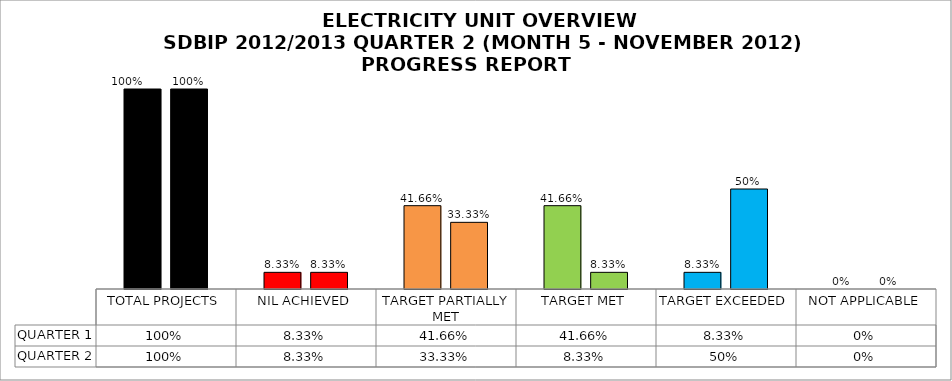
| Category | QUARTER 1 | QUARTER 2 |
|---|---|---|
| TOTAL PROJECTS | 1 | 1 |
| NIL ACHIEVED | 0.083 | 0.083 |
| TARGET PARTIALLY MET | 0.417 | 0.333 |
| TARGET MET | 0.417 | 0.083 |
| TARGET EXCEEDED | 0.083 | 0.5 |
| NOT APPLICABLE | 0 | 0 |